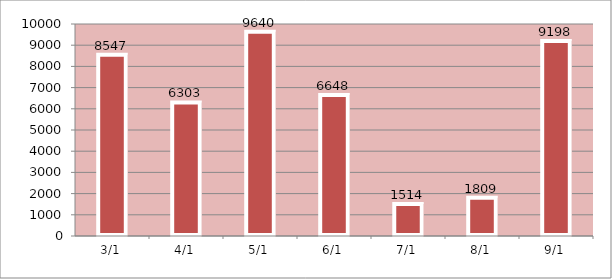
| Category | Сумма |
|---|---|
| 2010-01-03 | 8547 |
| 2010-01-04 | 6303 |
| 2010-01-05 | 9640 |
| 2010-01-06 | 6648 |
| 2010-01-07 | 1514 |
| 2010-01-08 | 1809 |